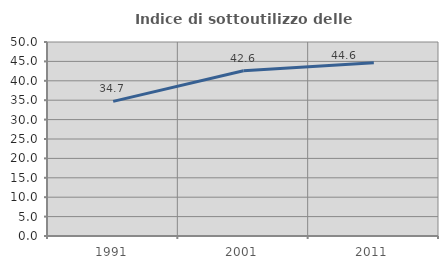
| Category | Indice di sottoutilizzo delle abitazioni  |
|---|---|
| 1991.0 | 34.699 |
| 2001.0 | 42.593 |
| 2011.0 | 44.634 |